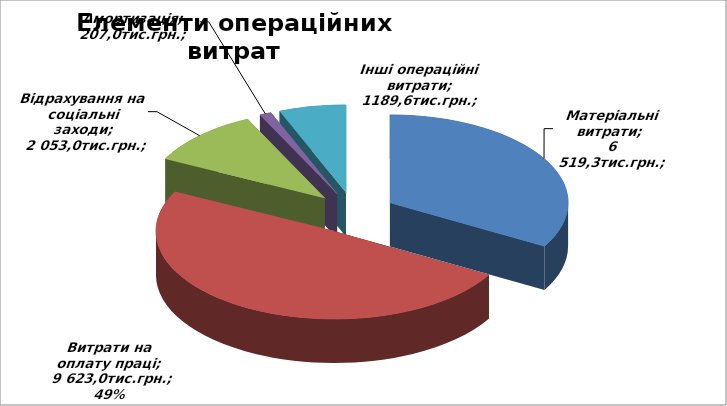
| Category | Series 0 |
|---|---|
| Матеріальні витрати | 6519.3 |
| Витрати на оплату праці | 9622.96 |
| Відрахування на соціальні заходи | 2053.007 |
| Амортизація | 207 |
| Інші операційні витрати | 1189.6 |